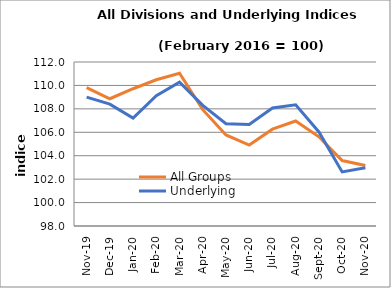
| Category | All Groups | Underlying |
|---|---|---|
| 2019-11-01 | 109.811 | 108.998 |
| 2019-12-01 | 108.864 | 108.4 |
| 2020-01-01 | 109.718 | 107.211 |
| 2020-02-01 | 110.483 | 109.121 |
| 2020-03-01 | 111.043 | 110.276 |
| 2020-04-01 | 107.93 | 108.297 |
| 2020-05-01 | 105.77 | 106.735 |
| 2020-06-01 | 104.913 | 106.661 |
| 2020-07-01 | 106.265 | 108.077 |
| 2020-08-01 | 106.963 | 108.349 |
| 2020-09-01 | 105.614 | 106.027 |
| 2020-10-01 | 103.588 | 102.619 |
| 2020-11-01 | 103.171 | 102.969 |